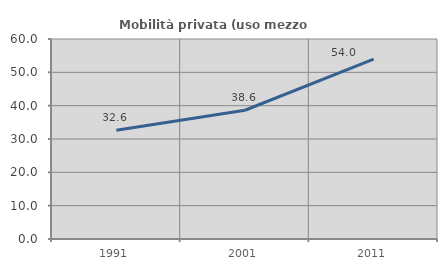
| Category | Mobilità privata (uso mezzo privato) |
|---|---|
| 1991.0 | 32.637 |
| 2001.0 | 38.623 |
| 2011.0 | 53.976 |